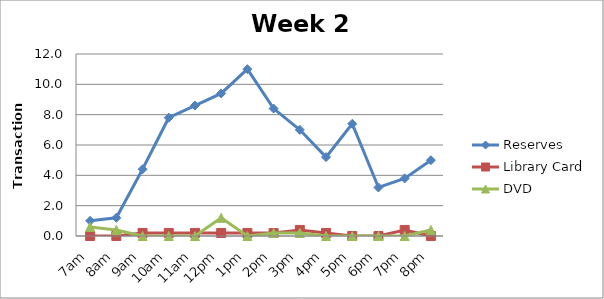
| Category | Reserves | Library Card | DVD |
|---|---|---|---|
| 7am | 1 | 0 | 0.6 |
| 8am | 1.2 | 0 | 0.4 |
| 9am | 4.4 | 0.2 | 0 |
| 10am | 7.8 | 0.2 | 0 |
| 11am | 8.6 | 0.2 | 0 |
| 12pm | 9.4 | 0.2 | 1.2 |
| 1pm | 11 | 0.2 | 0 |
| 2pm | 8.4 | 0.2 | 0.2 |
| 3pm | 7 | 0.4 | 0.2 |
| 4pm | 5.2 | 0.2 | 0 |
| 5pm | 7.4 | 0 | 0 |
| 6pm | 3.2 | 0 | 0 |
| 7pm | 3.8 | 0.4 | 0 |
| 8pm | 5 | 0 | 0.4 |